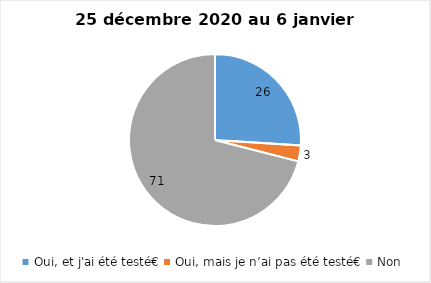
| Category | Series 0 |
|---|---|
| Oui, et j'ai été testé€ | 26 |
| Oui, mais je n’ai pas été testé€ | 3 |
| Non | 71 |